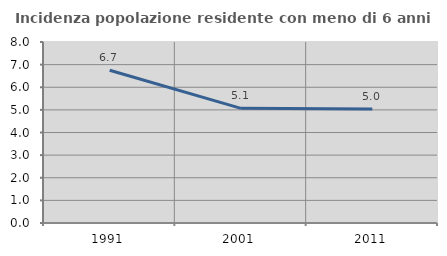
| Category | Incidenza popolazione residente con meno di 6 anni |
|---|---|
| 1991.0 | 6.749 |
| 2001.0 | 5.068 |
| 2011.0 | 5.034 |